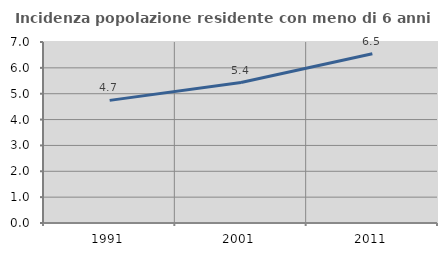
| Category | Incidenza popolazione residente con meno di 6 anni |
|---|---|
| 1991.0 | 4.742 |
| 2001.0 | 5.431 |
| 2011.0 | 6.545 |